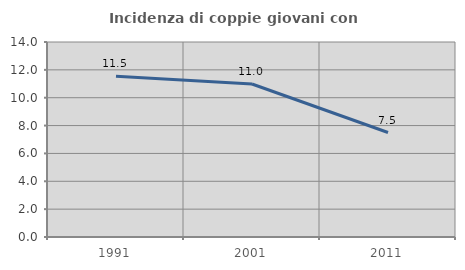
| Category | Incidenza di coppie giovani con figli |
|---|---|
| 1991.0 | 11.546 |
| 2001.0 | 10.985 |
| 2011.0 | 7.5 |